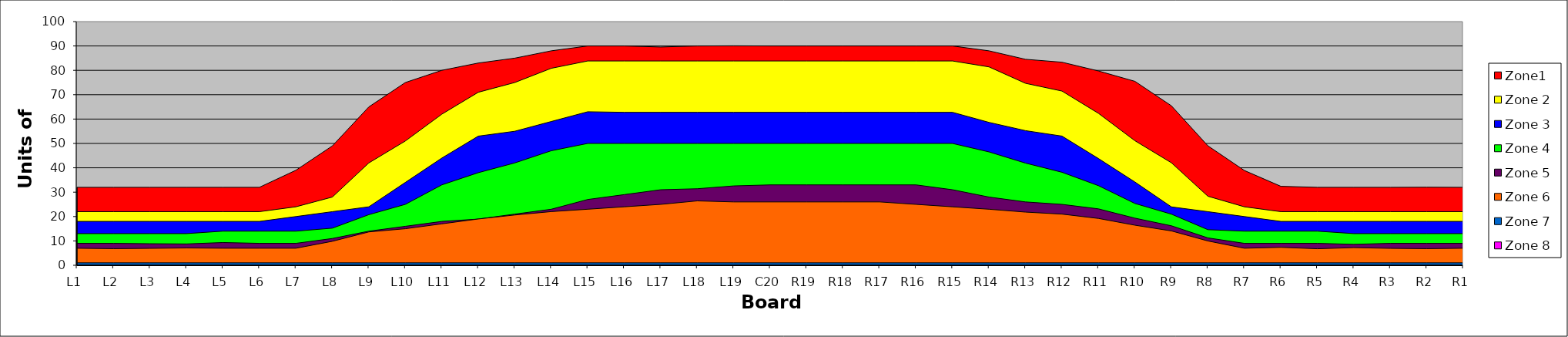
| Category | Zone1 | Zone 2 | Zone 3 | Zone 4 | Zone 5 | Zone 6 | Zone 7 | Zone 8 |
|---|---|---|---|---|---|---|---|---|
| L1 | 32 | 22 | 18 | 13 | 9 | 7 | 1 |  |
| L2 | 32 | 22 | 18 | 13 | 9 | 6.82 | 1 |  |
| L3 | 32 | 22 | 18 | 13 | 8.85 | 6.95 | 1 |  |
| L4 | 32 | 22 | 18 | 13 | 8.76 | 7.11 | 1 |  |
| L5 | 32 | 22 | 18 | 14 | 9.34 | 7 | 1 |  |
| L6 | 32 | 22 | 18 | 14 | 9 | 7 | 1 |  |
| L7 | 39 | 24 | 20 | 14 | 9 | 7 | 1 |  |
| L8 | 49 | 28 | 22 | 15.23 | 11 | 9.84 | 1 |  |
| L9 | 65 | 42 | 24 | 20.77 | 14 | 13.69 | 1 |  |
| L10 | 75 | 51 | 34 | 25 | 16 | 15 | 1 |  |
| L11 | 80 | 62 | 44 | 33 | 18 | 17 | 1 |  |
| L12 | 83 | 71 | 53 | 38 | 18.97 | 19 | 1 |  |
| L13 | 85 | 75 | 55 | 42 | 21 | 20.63 | 1 |  |
| L14 | 88 | 80.83 | 59 | 47 | 23 | 22.03 | 1 |  |
| L15 | 90 | 83.84 | 63 | 50 | 27 | 23 | 1 |  |
| L16 | 90 | 83.84 | 62.77 | 50 | 29 | 24 | 1 |  |
| L17 | 89.58 | 83.84 | 62.77 | 50 | 31 | 25 | 1 |  |
| L18 | 90 | 83.84 | 62.77 | 50 | 31.41 | 26.42 | 1 |  |
| L19 | 90.07 | 83.84 | 62.77 | 50 | 32.57 | 26 | 1 |  |
| C20 | 90 | 83.84 | 62.77 | 50 | 33 | 26 | 1 |  |
| R19 | 90 | 83.84 | 62.77 | 50 | 33 | 26 | 1 |  |
| R18 | 90 | 83.84 | 62.77 | 50 | 33 | 26 | 1 |  |
| R17 | 90 | 83.84 | 62.77 | 50 | 33 | 26 | 1 |  |
| R16 | 90 | 83.84 | 62.77 | 50 | 33 | 25 | 1 |  |
| R15 | 90 | 83.84 | 62.77 | 50 | 31 | 24 | 1 |  |
| R14 | 88 | 81.41 | 58.64 | 46.52 | 28 | 23 | 1 |  |
| R13 | 84.53 | 74.67 | 55.25 | 41.93 | 26 | 21.83 | 1 |  |
| R12 | 83.34 | 71.49 | 53.02 | 38.17 | 25 | 21 | 1 |  |
| R11 | 79.74 | 62.35 | 43.8 | 32.67 | 23.15 | 19.22 | 1 |  |
| R10 | 75.48 | 51.11 | 34.17 | 25.36 | 19.34 | 16.45 | 1 |  |
| R9 | 65.44 | 42.06 | 23.96 | 20.98 | 16.2 | 14.1 | 1 |  |
| R8 | 49.03 | 28.33 | 22 | 14.61 | 11.24 | 9.97 | 1 |  |
| R7 | 38.9 | 24 | 20 | 14 | 9 | 7 | 1 |  |
| R6 | 32.41 | 22 | 18 | 14 | 9 | 7.36 | 1 |  |
| R5 | 32 | 22 | 18 | 14 | 9 | 6.78 | 1 |  |
| R4 | 32 | 22 | 18 | 13 | 8.6 | 7.24 | 1 |  |
| R3 | 32 | 22 | 18 | 13 | 9 | 6.95 | 1 |  |
| R2 | 32.04 | 22 | 18 | 13 | 9 | 6.82 | 1 |  |
| R1 | 32 | 22 | 18 | 13 | 9 | 7 | 1 |  |